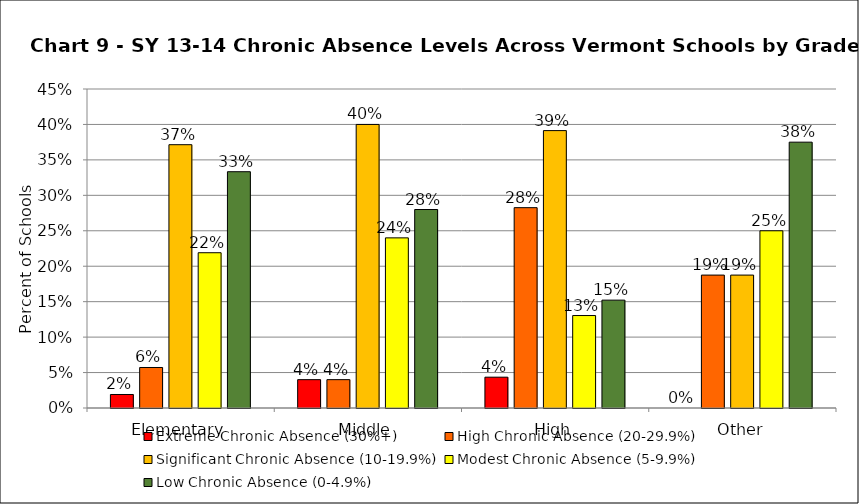
| Category | Extreme Chronic Absence (30%+) | High Chronic Absence (20-29.9%) | Significant Chronic Absence (10-19.9%) | Modest Chronic Absence (5-9.9%) | Low Chronic Absence (0-4.9%) |
|---|---|---|---|---|---|
| 0 | 0.019 | 0.057 | 0.371 | 0.219 | 0.333 |
| 1 | 0.04 | 0.04 | 0.4 | 0.24 | 0.28 |
| 2 | 0.043 | 0.283 | 0.391 | 0.13 | 0.152 |
| 3 | 0 | 0.188 | 0.188 | 0.25 | 0.375 |